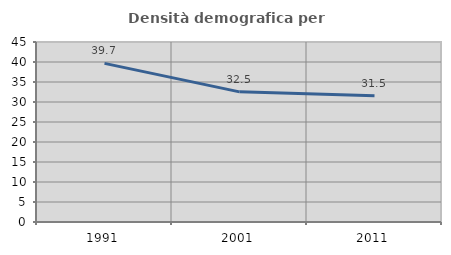
| Category | Densità demografica |
|---|---|
| 1991.0 | 39.658 |
| 2001.0 | 32.539 |
| 2011.0 | 31.533 |